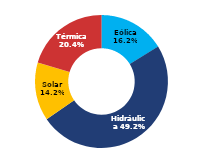
| Category | Sur |
|---|---|
| Eólica | 85.918 |
| Hidráulica | 260.874 |
| Solar | 75.047 |
| Térmica | 108.238 |